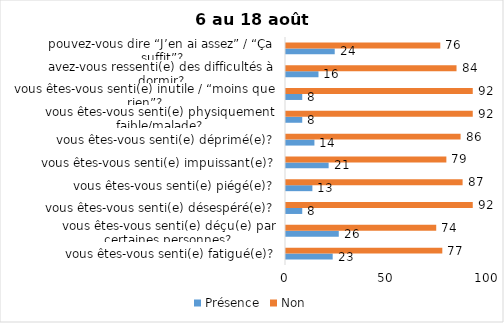
| Category | Présence | Non |
|---|---|---|
| vous êtes-vous senti(e) fatigué(e)? | 23 | 77 |
| vous êtes-vous senti(e) déçu(e) par certaines personnes? | 26 | 74 |
| vous êtes-vous senti(e) désespéré(e)? | 8 | 92 |
| vous êtes-vous senti(e) piégé(e)? | 13 | 87 |
| vous êtes-vous senti(e) impuissant(e)? | 21 | 79 |
| vous êtes-vous senti(e) déprimé(e)? | 14 | 86 |
| vous êtes-vous senti(e) physiquement faible/malade? | 8 | 92 |
| vous êtes-vous senti(e) inutile / “moins que rien”? | 8 | 92 |
| avez-vous ressenti(e) des difficultés à dormir? | 16 | 84 |
| pouvez-vous dire “J’en ai assez” / “Ça suffit”? | 24 | 76 |